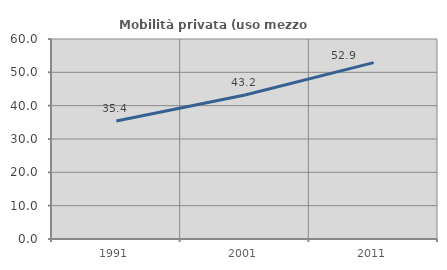
| Category | Mobilità privata (uso mezzo privato) |
|---|---|
| 1991.0 | 35.412 |
| 2001.0 | 43.191 |
| 2011.0 | 52.919 |